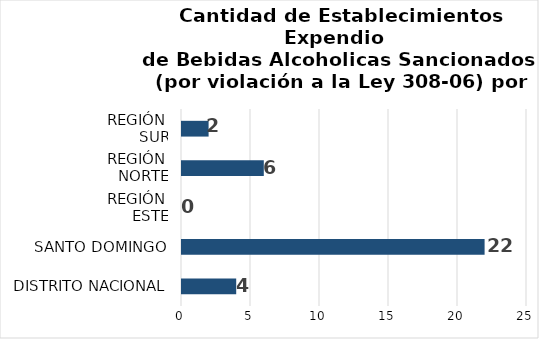
| Category | Series 0 |
|---|---|
| DISTRITO NACIONAL | 4 |
| SANTO DOMINGO | 22 |
| REGIÓN 
ESTE | 0 |
| REGIÓN 
NORTE | 6 |
| REGIÓN 
SUR | 2 |